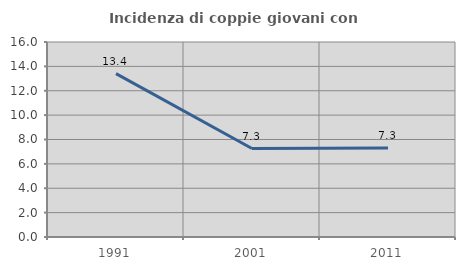
| Category | Incidenza di coppie giovani con figli |
|---|---|
| 1991.0 | 13.406 |
| 2001.0 | 7.258 |
| 2011.0 | 7.306 |